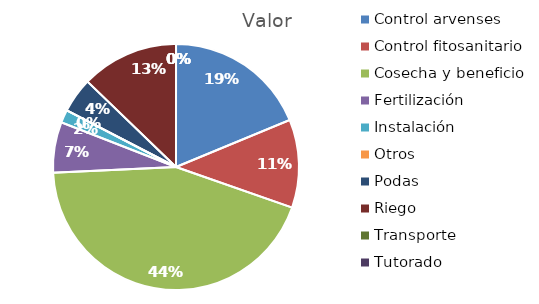
| Category | Valor |
|---|---|
| Control arvenses | 13839820 |
| Control fitosanitario | 8555488 |
| Cosecha y beneficio | 32395937.968 |
| Fertilización | 4906824 |
| Instalación | 1258160 |
| Otros | 0 |
| Podas | 3397032 |
| Riego | 9436200 |
| Transporte | 0 |
| Tutorado | 0 |